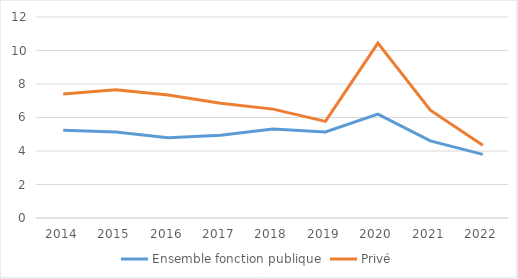
| Category | Ensemble fonction publique | Privé |
|---|---|---|
| 2014.0 | 5.24 | 7.41 |
| 2015.0 | 5.13 | 7.66 |
| 2016.0 | 4.79 | 7.34 |
| 2017.0 | 4.94 | 6.85 |
| 2018.0 | 5.31 | 6.5 |
| 2019.0 | 5.14 | 5.77 |
| 2020.0 | 6.2 | 10.44 |
| 2021.0 | 4.6 | 6.44 |
| 2022.0 | 3.8 | 4.34 |